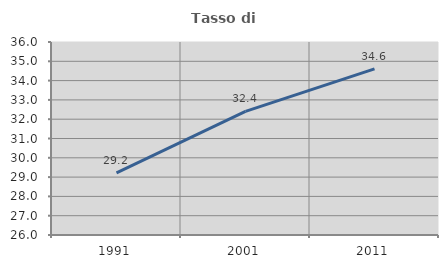
| Category | Tasso di occupazione   |
|---|---|
| 1991.0 | 29.218 |
| 2001.0 | 32.404 |
| 2011.0 | 34.61 |